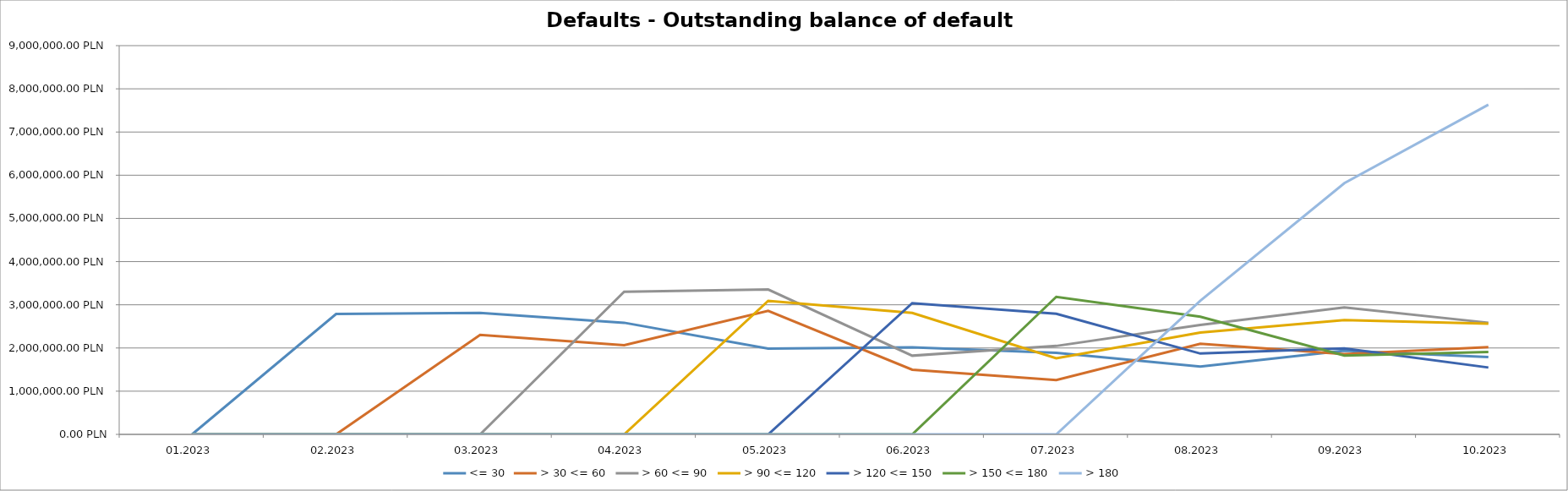
| Category | <= 30 | > 30 <= 60 | > 60 <= 90 | > 90 <= 120 | > 120 <= 150 | > 150 <= 180 | > 180 |
|---|---|---|---|---|---|---|---|
| 01.2023 | 0 | 0 | 0 | 0 | 0 | 0 | 0 |
| 02.2023 | 2788519.82 | 0 | 0 | 0 | 0 | 0 | 0 |
| 03.2023 | 2811517.14 | 2305154.07 | 0 | 0 | 0 | 0 | 0 |
| 04.2023 | 2584791.3 | 2064675.87 | 3301101.31 | 0 | 0 | 0 | 0 |
| 05.2023 | 1985441.56 | 2858398.5 | 3353485.78 | 3091988.77 | 0 | 0 | 0 |
| 06.2023 | 2016845.02 | 1496657.8 | 1822162.63 | 2812422.86 | 3037767.68 | 0 | 0 |
| 07.2023 | 1886118.05 | 1257979.4 | 2047168.21 | 1762916.26 | 2793763.11 | 3184053.47 | 0 |
| 08.2023 | 1572650.17 | 2099798.77 | 2534461.69 | 2357426.74 | 1871124.51 | 2723545.23 | 3093972.9 |
| 09.2023 | 1936023.84 | 1858916.55 | 2940706.37 | 2644290.89 | 1991761.95 | 1826544.8 | 5816448.05 |
| 10.2023 | 1787856.09 | 2019010.42 | 2585069.36 | 2560620.78 | 1548143.78 | 1909160.81 | 7632122.35 |